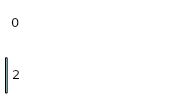
| Category | Series 0 | Series 1 |
|---|---|---|
| 0 | 2 | 0 |